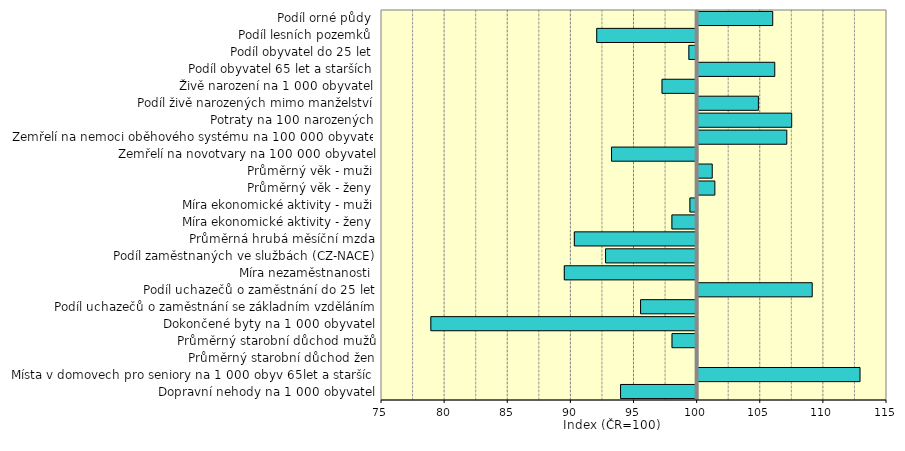
| Category | Series 0 |
|---|---|
| Dopravní nehody na 1 000 obyvatel | 93.936 |
| Místa v domovech pro seniory na 1 000 obyv 65let a starších | 112.865 |
| Průměrný starobní důchod žen | 99.929 |
| Průměrný starobní důchod mužů | 98.012 |
| Dokončené byty na 1 000 obyvatel | 78.909 |
| Podíl uchazečů o zaměstnání se základním vzděláním | 95.521 |
| Podíl uchazečů o zaměstnání do 25 let | 109.076 |
| Míra nezaměstnanosti | 89.48 |
| Podíl zaměstnaných ve službách (CZ-NACE) | 92.748 |
| Průměrná hrubá měsíční mzda | 90.274 |
| Míra ekonomické aktivity - ženy | 98.003 |
| Míra ekonomické aktivity - muži | 99.428 |
| Průměrný věk - ženy | 101.366 |
| Průměrný věk - muži | 101.158 |
| Zemřelí na novotvary na 100 000 obyvatel | 93.221 |
| Zemřelí na nemoci oběhového systému na 100 000 obyvatel | 107.064 |
| Potraty na 100 narozených | 107.451 |
| Podíl živě narozených mimo manželství | 104.814 |
| Živě narození na 1 000 obyvatel | 97.22 |
| Podíl obyvatel 65 let a starších | 106.111 |
| Podíl obyvatel do 25 let | 99.346 |
| Podíl lesních pozemků | 92.048 |
| Podíl orné půdy | 105.949 |